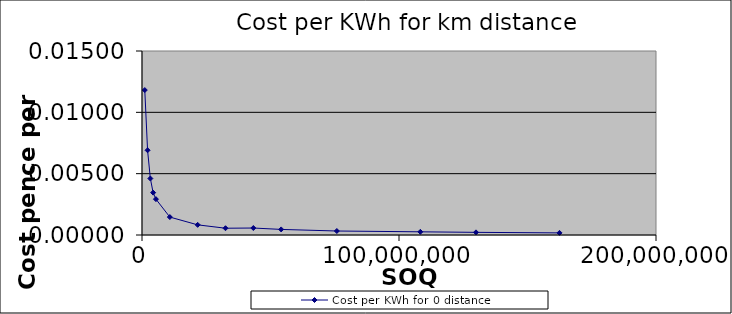
| Category | Cost per KWh for 0 distance |
|---|---|
| 162450000.0 | 0 |
| 129960000.0 | 0 |
| 108300000.0 | 0 |
| 75810000.0 | 0 |
| 54150000.0 | 0 |
| 43320000.0 | 0.001 |
| 32490000.0 | 0.001 |
| 21660000.0 | 0.001 |
| 10830000.0 | 0.001 |
| 5415000.0 | 0.003 |
| 4332000.0 | 0.003 |
| 3249000.0 | 0.005 |
| 2166000.0 | 0.007 |
| 1083000.0 | 0.012 |